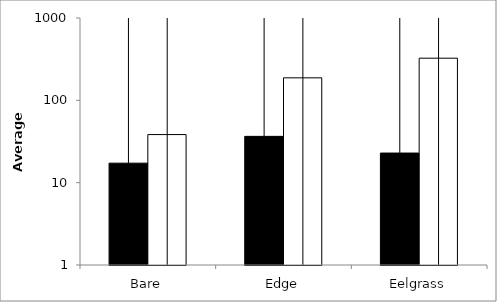
| Category | Video | Seine |
|---|---|---|
| Bare | 17.25 | 38.389 |
| Edge | 36.5 | 187.611 |
| Eelgrass | 22.889 | 324.889 |